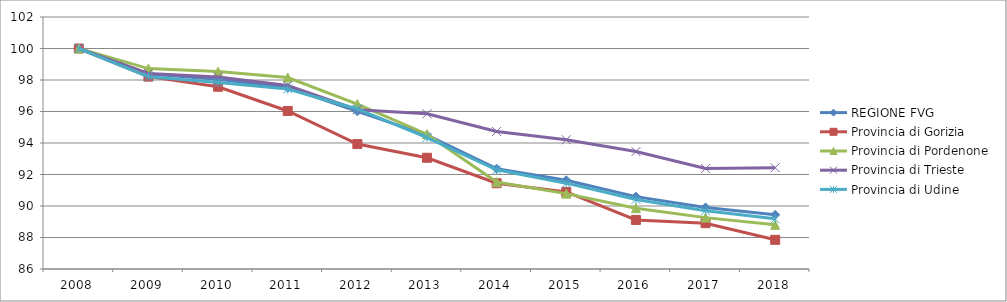
| Category | REGIONE FVG | Provincia di Gorizia  | Provincia di Pordenone | Provincia di Trieste | Provincia di Udine |
|---|---|---|---|---|---|
| 2008.0 | 100 | 100 | 100 | 100 | 100 |
| 2009.0 | 98.378 | 98.214 | 98.723 | 98.416 | 98.213 |
| 2010.0 | 98.049 | 97.573 | 98.535 | 98.197 | 97.839 |
| 2011.0 | 97.515 | 96.033 | 98.157 | 97.653 | 97.431 |
| 2012.0 | 96.012 | 93.931 | 96.472 | 96.115 | 96.162 |
| 2013.0 | 94.5 | 93.063 | 94.558 | 95.857 | 94.348 |
| 2014.0 | 92.37 | 91.445 | 91.517 | 94.73 | 92.296 |
| 2015.0 | 91.632 | 90.892 | 90.784 | 94.206 | 91.451 |
| 2016.0 | 90.595 | 89.116 | 89.863 | 93.457 | 90.414 |
| 2017.0 | 89.908 | 88.909 | 89.262 | 92.376 | 89.702 |
| 2018.0 | 89.439 | 87.853 | 88.805 | 92.429 | 89.187 |